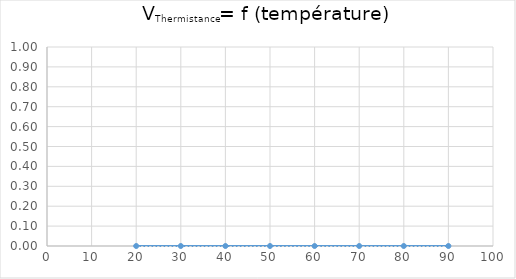
| Category | Series 0 |
|---|---|
| 20.0 | 0 |
| 30.0 | 0 |
| 40.0 | 0 |
| 50.0 | 0 |
| 60.0 | 0 |
| 70.0 | 0 |
| 80.0 | 0 |
| 90.0 | 0 |